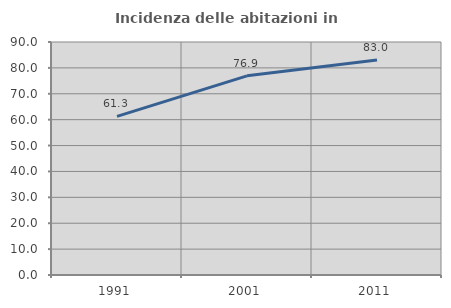
| Category | Incidenza delle abitazioni in proprietà  |
|---|---|
| 1991.0 | 61.293 |
| 2001.0 | 76.923 |
| 2011.0 | 83.035 |